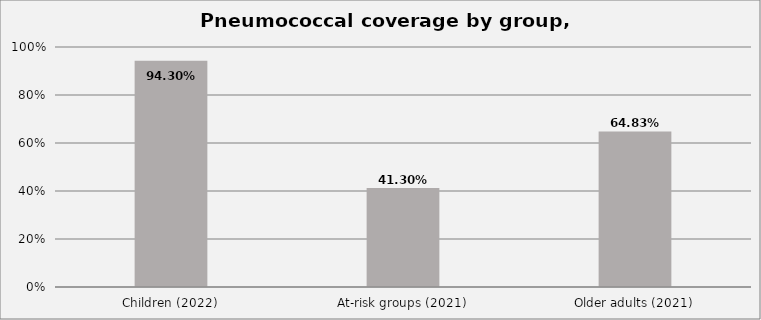
| Category | Series 0 |
|---|---|
| Children (2022) | 0.943 |
| At-risk groups (2021) | 0.413 |
| Older adults (2021) | 0.648 |